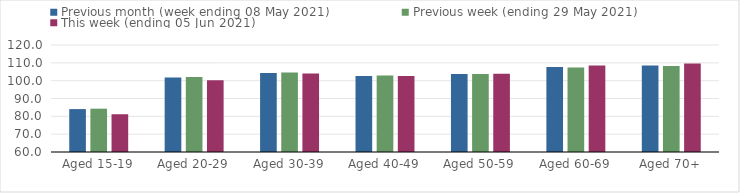
| Category | Previous month (week ending 08 May 2021) | Previous week (ending 29 May 2021) | This week (ending 05 Jun 2021) |
|---|---|---|---|
| Aged 15-19 | 84.06 | 84.29 | 81.18 |
| Aged 20-29 | 101.76 | 102.02 | 100.21 |
| Aged 30-39 | 104.36 | 104.61 | 103.96 |
| Aged 40-49 | 102.65 | 102.91 | 102.66 |
| Aged 50-59 | 103.67 | 103.68 | 103.91 |
| Aged 60-69 | 107.7 | 107.43 | 108.52 |
| Aged 70+ | 108.46 | 108.21 | 109.63 |